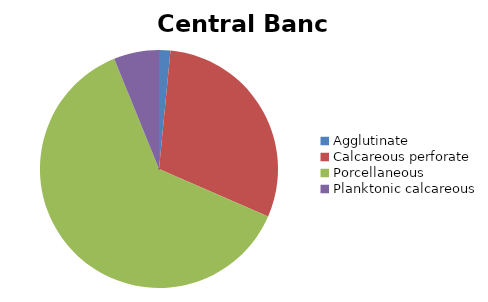
| Category | Central Banc d'Arguin |
|---|---|
| ﻿Agglutinate | 1.542 |
| Calcareous perforate | 29.991 |
| Porcellaneous | 62.319 |
| Planktonic calcareous | 6.147 |